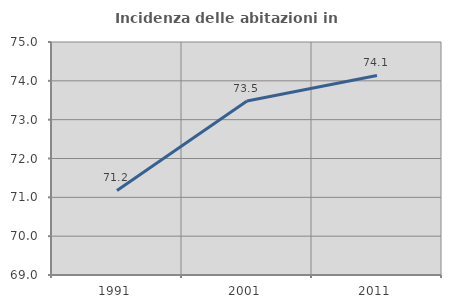
| Category | Incidenza delle abitazioni in proprietà  |
|---|---|
| 1991.0 | 71.176 |
| 2001.0 | 73.481 |
| 2011.0 | 74.138 |